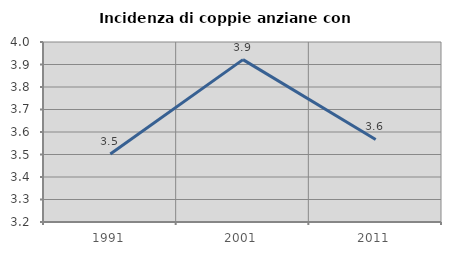
| Category | Incidenza di coppie anziane con figli |
|---|---|
| 1991.0 | 3.502 |
| 2001.0 | 3.922 |
| 2011.0 | 3.567 |